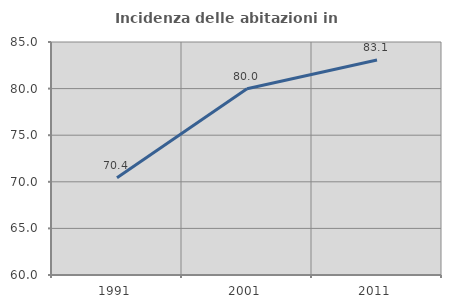
| Category | Incidenza delle abitazioni in proprietà  |
|---|---|
| 1991.0 | 70.437 |
| 2001.0 | 79.987 |
| 2011.0 | 83.061 |